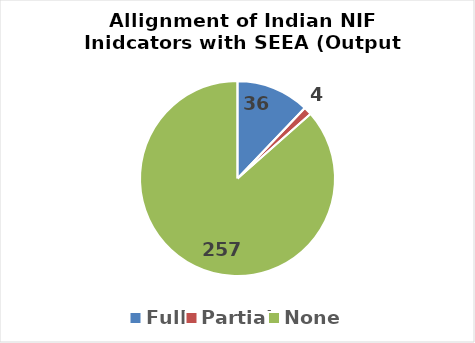
| Category | Series 0 |
|---|---|
| Full | 36 |
| Partial | 4 |
| None | 257 |